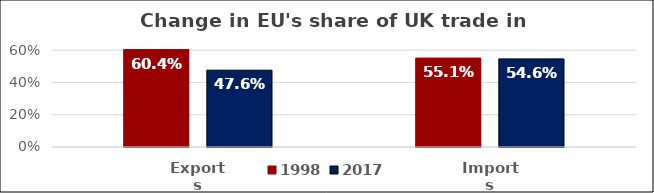
| Category | 1998 | 2017 |
|---|---|---|
| Exports | 0.604 | 0.476 |
| Imports | 0.551 | 0.546 |